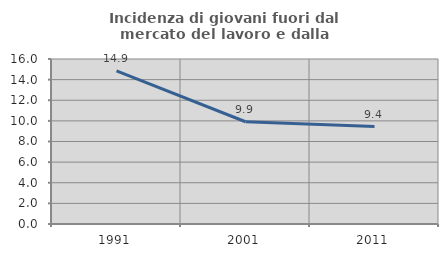
| Category | Incidenza di giovani fuori dal mercato del lavoro e dalla formazione  |
|---|---|
| 1991.0 | 14.855 |
| 2001.0 | 9.914 |
| 2011.0 | 9.444 |